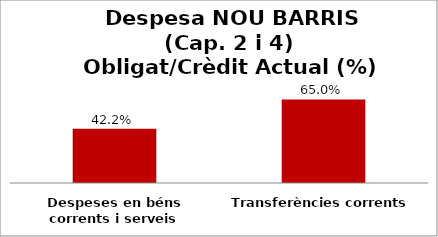
| Category | Series 0 |
|---|---|
| Despeses en béns corrents i serveis | 0.422 |
| Transferències corrents | 0.65 |